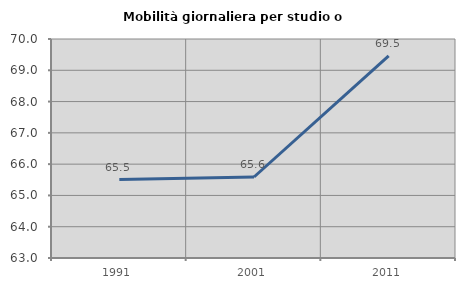
| Category | Mobilità giornaliera per studio o lavoro |
|---|---|
| 1991.0 | 65.507 |
| 2001.0 | 65.589 |
| 2011.0 | 69.462 |